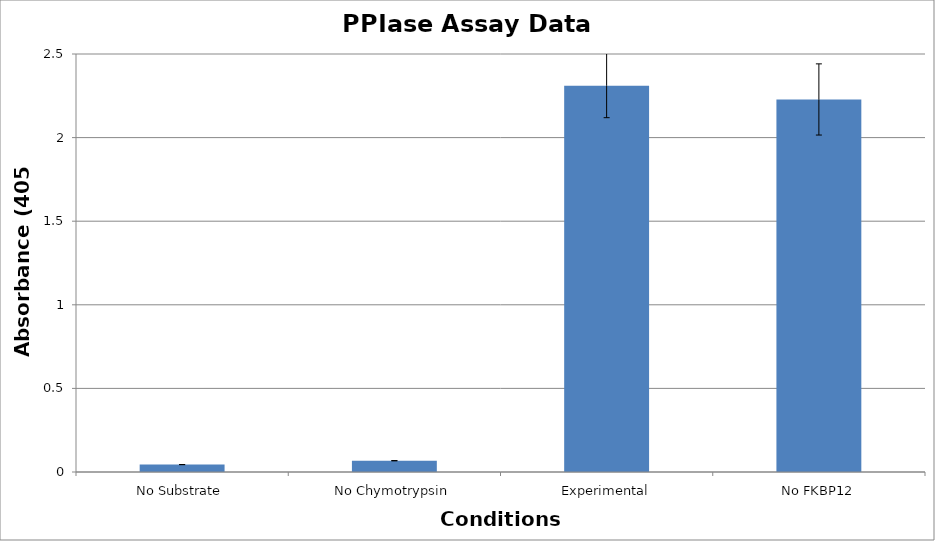
| Category | Series 0 |
|---|---|
| No Substrate | 0.044 |
| No Chymotrypsin | 0.068 |
| Experimental | 2.31 |
| No FKBP12 | 2.228 |